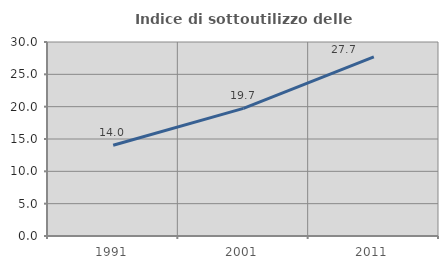
| Category | Indice di sottoutilizzo delle abitazioni  |
|---|---|
| 1991.0 | 14.03 |
| 2001.0 | 19.737 |
| 2011.0 | 27.714 |